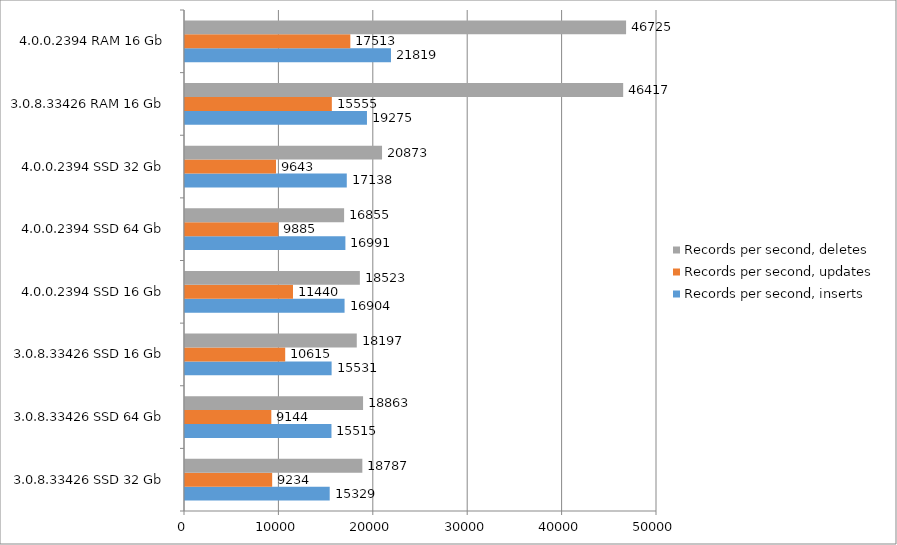
| Category | Records per second, inserts | Records per second, updates | Records per second, deletes |
|---|---|---|---|
| 3.0.8.33426 SSD 32 Gb | 15329.194 | 9234.378 | 18786.752 |
| 3.0.8.33426 SSD 64 Gb | 15515.422 | 9144.111 | 18863.298 |
| 3.0.8.33426 SSD 16 Gb | 15531.085 | 10614.81 | 18196.706 |
| 4.0.0.2394 SSD 16 Gb | 16903.599 | 11440.47 | 18523.321 |
| 4.0.0.2394 SSD 64 Gb | 16990.621 | 9885.428 | 16854.879 |
| 4.0.0.2394 SSD 32 Gb | 17138.254 | 9642.923 | 20872.905 |
| 3.0.8.33426 RAM 16 Gb | 19275.251 | 15555.002 | 46416.636 |
| 4.0.0.2394 RAM 16 Gb | 21818.817 | 17513.135 | 46724.605 |